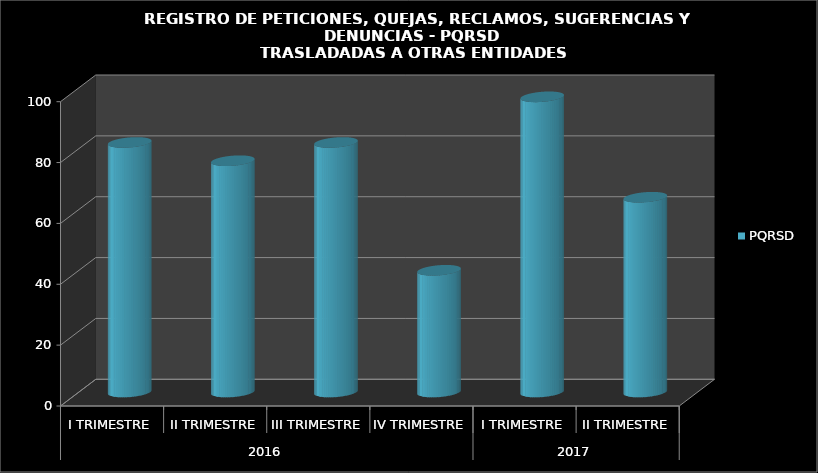
| Category | PQRSD  |
|---|---|
| 0 | 82 |
| 1 | 76 |
| 2 | 82 |
| 3 | 40 |
| 4 | 97 |
| 5 | 64 |